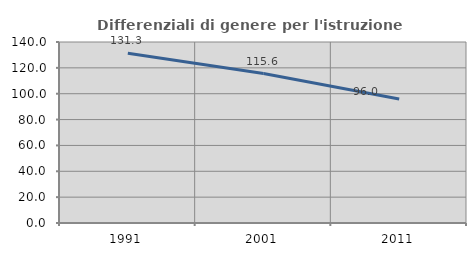
| Category | Differenziali di genere per l'istruzione superiore |
|---|---|
| 1991.0 | 131.261 |
| 2001.0 | 115.559 |
| 2011.0 | 95.976 |